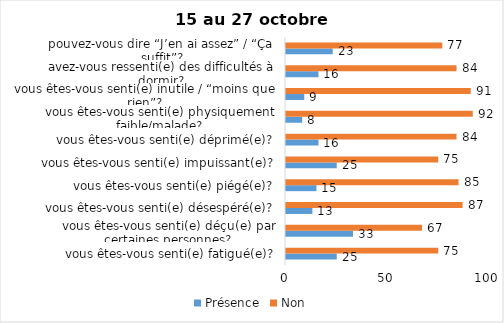
| Category | Présence | Non |
|---|---|---|
| vous êtes-vous senti(e) fatigué(e)? | 25 | 75 |
| vous êtes-vous senti(e) déçu(e) par certaines personnes? | 33 | 67 |
| vous êtes-vous senti(e) désespéré(e)? | 13 | 87 |
| vous êtes-vous senti(e) piégé(e)? | 15 | 85 |
| vous êtes-vous senti(e) impuissant(e)? | 25 | 75 |
| vous êtes-vous senti(e) déprimé(e)? | 16 | 84 |
| vous êtes-vous senti(e) physiquement faible/malade? | 8 | 92 |
| vous êtes-vous senti(e) inutile / “moins que rien”? | 9 | 91 |
| avez-vous ressenti(e) des difficultés à dormir? | 16 | 84 |
| pouvez-vous dire “J’en ai assez” / “Ça suffit”? | 23 | 77 |